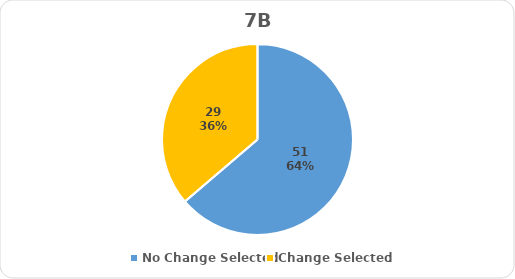
| Category | Series 0 |
|---|---|
| No Change Selected | 51 |
| Change Selected | 29 |